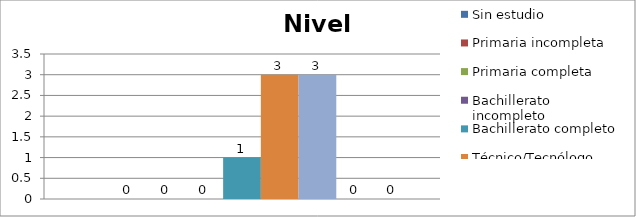
| Category | Sin estudio | Primaria incompleta | Primaria completa | Bachillerato incompleto | Bachillerato completo | Técnico/Tecnólogo | Universitario | Post-grado | Especialización |
|---|---|---|---|---|---|---|---|---|---|
| 0 |  | 0 | 0 | 0 | 1 | 3 | 3 | 0 | 0 |